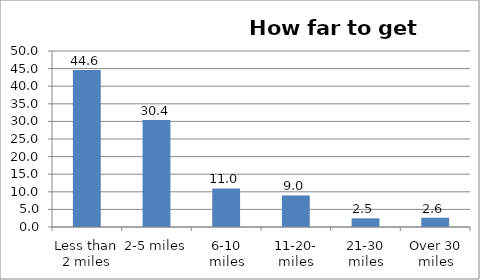
| Category | Series 0 |
|---|---|
| Less than 2 miles | 44.588 |
| 2-5 miles | 30.393 |
| 6-10 miles | 10.956 |
| 11-20- miles | 8.964 |
| 21-30 miles | 2.464 |
| Over 30 miles | 2.635 |